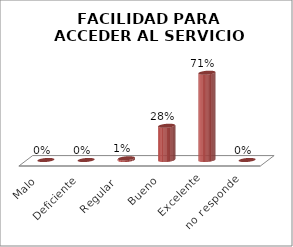
| Category | Series 0 |
|---|---|
| Malo | 0 |
| Deficiente | 0 |
| Regular  | 0.014 |
| Bueno | 0.278 |
| Excelente | 0.708 |
| no responde | 0 |